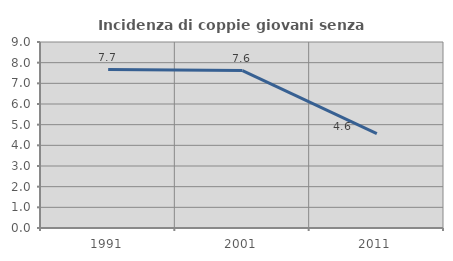
| Category | Incidenza di coppie giovani senza figli |
|---|---|
| 1991.0 | 7.669 |
| 2001.0 | 7.616 |
| 2011.0 | 4.565 |